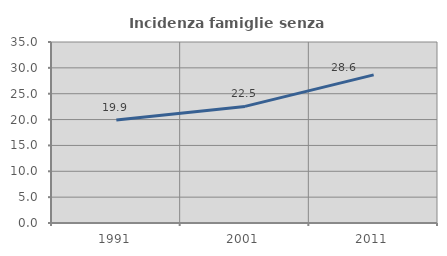
| Category | Incidenza famiglie senza nuclei |
|---|---|
| 1991.0 | 19.925 |
| 2001.0 | 22.546 |
| 2011.0 | 28.635 |